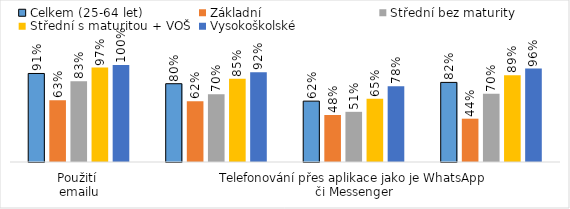
| Category | Celkem (25-64 let) | Základní | Střední bez maturity | Střední s maturitou + VOŠ | Vysokoškolské |
|---|---|---|---|---|---|
| Použití 
emailu | 0.908 | 0.633 | 0.828 | 0.968 | 0.995 |
| Zásílání zpráv přes aplikace jako je WhatsApp či Messenger | 0.803 | 0.623 | 0.696 | 0.854 | 0.92 |
| Telefonování přes aplikace jako je WhatsApp či Messenger | 0.624 | 0.482 | 0.515 | 0.649 | 0.776 |
| Použití internetového bankovnictví | 0.816 | 0.444 | 0.701 | 0.89 | 0.959 |